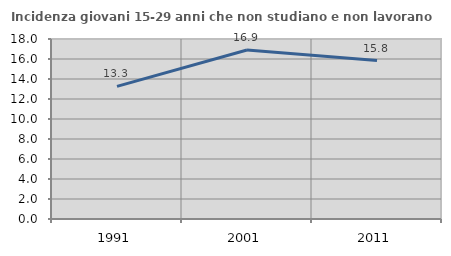
| Category | Incidenza giovani 15-29 anni che non studiano e non lavorano  |
|---|---|
| 1991.0 | 13.258 |
| 2001.0 | 16.906 |
| 2011.0 | 15.842 |